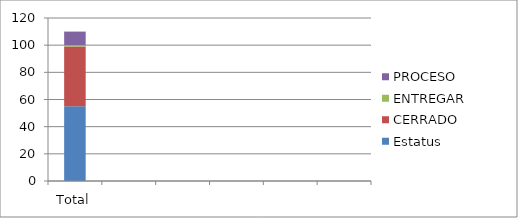
| Category | Estatus | CERRADO | ENTREGAR | PROCESO |
|---|---|---|---|---|
| Total | 55 | 44 | 1 | 10 |